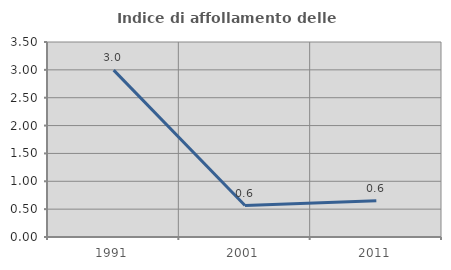
| Category | Indice di affollamento delle abitazioni  |
|---|---|
| 1991.0 | 2.995 |
| 2001.0 | 0.565 |
| 2011.0 | 0.649 |